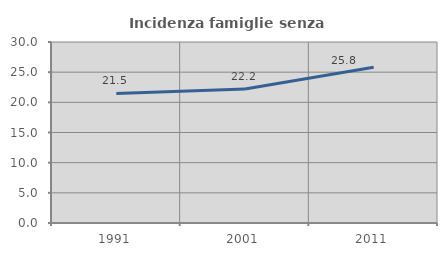
| Category | Incidenza famiglie senza nuclei |
|---|---|
| 1991.0 | 21.471 |
| 2001.0 | 22.201 |
| 2011.0 | 25.806 |